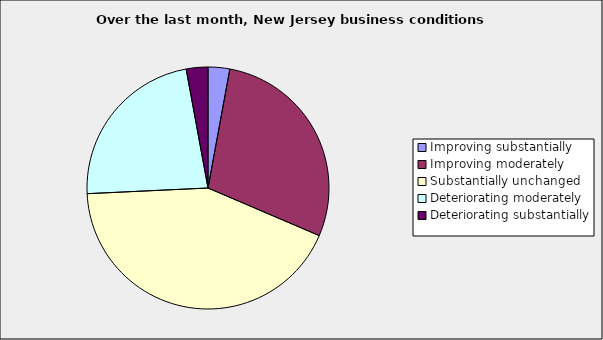
| Category | Series 0 |
|---|---|
| Improving substantially | 0.029 |
| Improving moderately | 0.286 |
| Substantially unchanged | 0.429 |
| Deteriorating moderately | 0.229 |
| Deteriorating substantially | 0.029 |